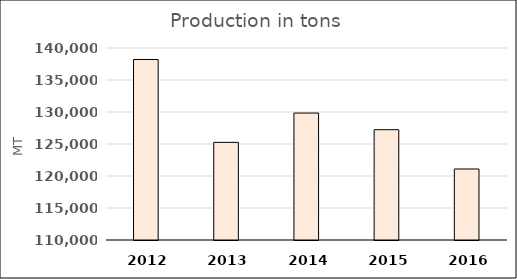
| Category | Production in tons |
|---|---|
| 2012.0 | 138204 |
| 2013.0 | 125256 |
| 2014.0 | 129834.45 |
| 2015.0 | 127235 |
| 2016.0 | 121094 |